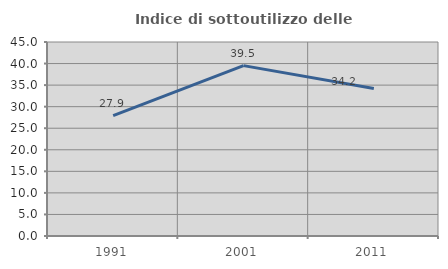
| Category | Indice di sottoutilizzo delle abitazioni  |
|---|---|
| 1991.0 | 27.933 |
| 2001.0 | 39.524 |
| 2011.0 | 34.199 |